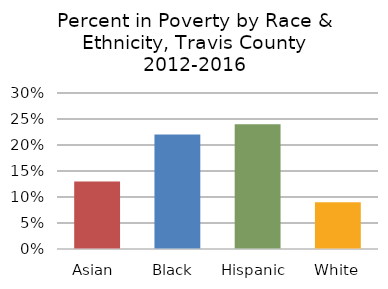
| Category | Total |
|---|---|
| Asian  | 0.13 |
| Black  | 0.22 |
| Hispanic  | 0.24 |
| White | 0.09 |